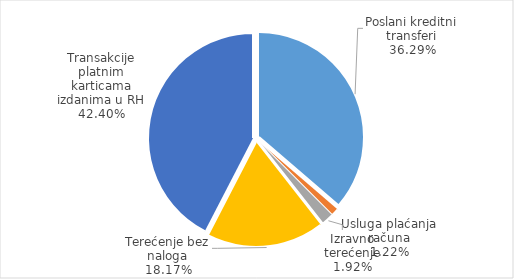
| Category | Ukupno |
|---|---|
| Poslani kreditni transferi | 380795737 |
| Usluga plaćanja računa | 12813576 |
| Izravno terećenje | 20117260 |
| Terećenje bez naloga | 190682414 |
| Transakcije platnim karticama izdanima u RH | 444944049 |